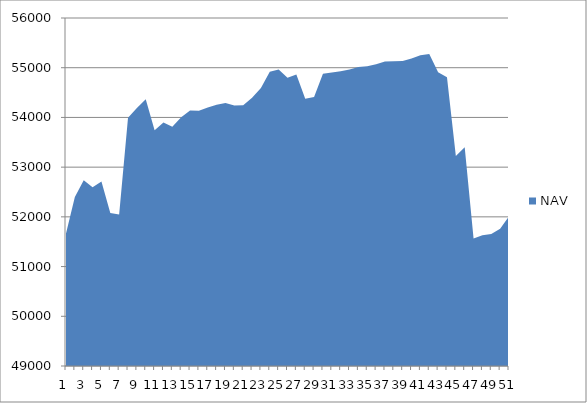
| Category | NAV |
|---|---|
| 0 | 51667 |
| 1 | 52397 |
| 2 | 52733.957 |
| 3 | 52597.875 |
| 4 | 52708.772 |
| 5 | 52075.184 |
| 6 | 52046.775 |
| 7 | 53991.219 |
| 8 | 54189.909 |
| 9 | 54364.909 |
| 10 | 53739.909 |
| 11 | 53899.542 |
| 12 | 53812.294 |
| 13 | 54003.961 |
| 14 | 54140.037 |
| 15 | 54132.37 |
| 16 | 54197.37 |
| 17 | 54255.812 |
| 18 | 54292.622 |
| 19 | 54240.699 |
| 20 | 54246.834 |
| 21 | 54397.391 |
| 22 | 54592.197 |
| 23 | 54920.119 |
| 24 | 54963.245 |
| 25 | 54796.799 |
| 26 | 54863.963 |
| 27 | 54375.975 |
| 28 | 54409.015 |
| 29 | 54878.402 |
| 30 | 54905.151 |
| 31 | 54927.958 |
| 32 | 54964.157 |
| 33 | 55012.385 |
| 34 | 55031.616 |
| 35 | 55070.791 |
| 36 | 55126.461 |
| 37 | 55131.71 |
| 38 | 55133.391 |
| 39 | 55184.783 |
| 40 | 55249.119 |
| 41 | 55278.196 |
| 42 | 54909.993 |
| 43 | 54807.052 |
| 44 | 53224.092 |
| 45 | 53401.214 |
| 46 | 51567.133 |
| 47 | 51627.536 |
| 48 | 51656.382 |
| 49 | 51762.295 |
| 50 | 52007.329 |